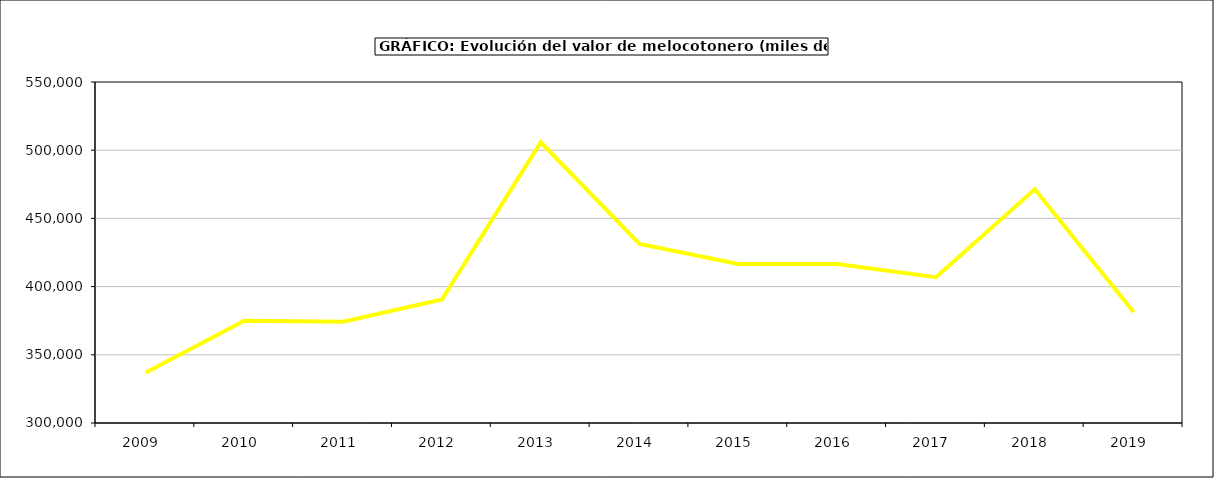
| Category | valor melocotonero |
|---|---|
| 2009.0 | 336769.335 |
| 2010.0 | 374959.034 |
| 2011.0 | 374235.162 |
| 2012.0 | 390522.664 |
| 2013.0 | 505779.721 |
| 2014.0 | 431268.365 |
| 2015.0 | 416638 |
| 2016.0 | 416500 |
| 2017.0 | 406839.379 |
| 2018.0 | 471336.394 |
| 2019.0 | 381426.562 |